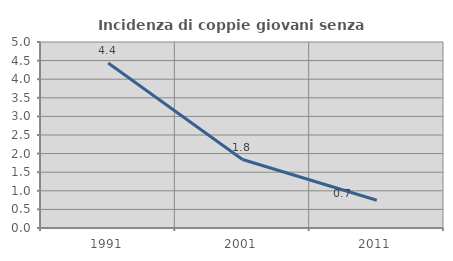
| Category | Incidenza di coppie giovani senza figli |
|---|---|
| 1991.0 | 4.433 |
| 2001.0 | 1.84 |
| 2011.0 | 0.746 |